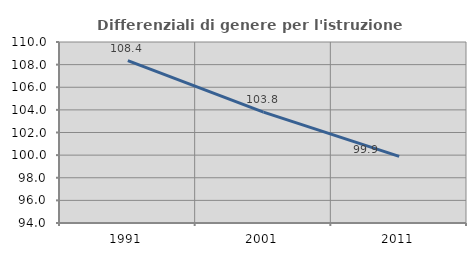
| Category | Differenziali di genere per l'istruzione superiore |
|---|---|
| 1991.0 | 108.353 |
| 2001.0 | 103.799 |
| 2011.0 | 99.889 |